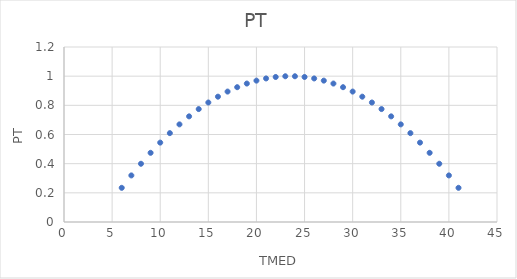
| Category | Series 0 |
|---|---|
| 6.0 | 0.234 |
| 7.0 | 0.319 |
| 8.0 | 0.399 |
| 9.0 | 0.474 |
| 10.0 | 0.544 |
| 11.0 | 0.609 |
| 12.0 | 0.669 |
| 13.0 | 0.724 |
| 14.0 | 0.774 |
| 15.0 | 0.819 |
| 16.0 | 0.859 |
| 17.0 | 0.894 |
| 18.0 | 0.924 |
| 19.0 | 0.949 |
| 20.0 | 0.969 |
| 21.0 | 0.984 |
| 22.0 | 0.994 |
| 23.0 | 0.999 |
| 24.0 | 0.999 |
| 25.0 | 0.994 |
| 26.0 | 0.984 |
| 27.0 | 0.969 |
| 28.0 | 0.949 |
| 29.0 | 0.924 |
| 30.0 | 0.894 |
| 31.0 | 0.859 |
| 32.0 | 0.819 |
| 33.0 | 0.774 |
| 34.0 | 0.724 |
| 35.0 | 0.669 |
| 36.0 | 0.609 |
| 37.0 | 0.544 |
| 38.0 | 0.474 |
| 39.0 | 0.399 |
| 40.0 | 0.319 |
| 41.0 | 0.234 |